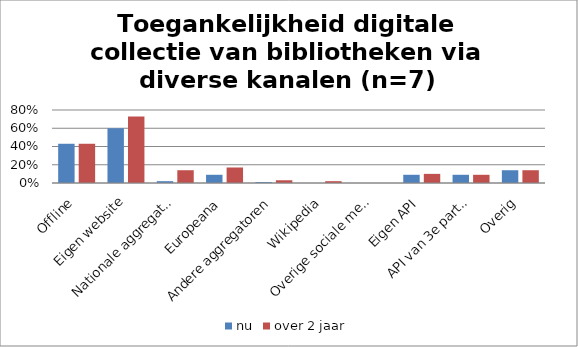
| Category | nu | over 2 jaar |
|---|---|---|
| Offline | 0.43 | 0.43 |
| Eigen website | 0.6 | 0.73 |
| Nationale aggregator | 0.02 | 0.14 |
| Europeana | 0.09 | 0.17 |
| Andere aggregatoren | 0.01 | 0.03 |
| Wikipedia | 0 | 0.02 |
| Overige sociale media | 0 | 0 |
| Eigen API | 0.09 | 0.1 |
| API van 3e partij | 0.09 | 0.09 |
| Overig | 0.14 | 0.14 |